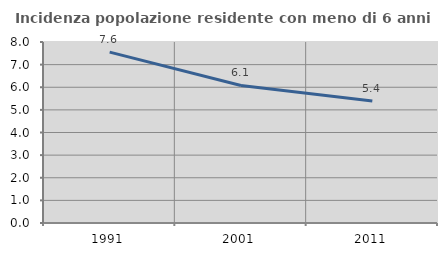
| Category | Incidenza popolazione residente con meno di 6 anni |
|---|---|
| 1991.0 | 7.554 |
| 2001.0 | 6.081 |
| 2011.0 | 5.394 |